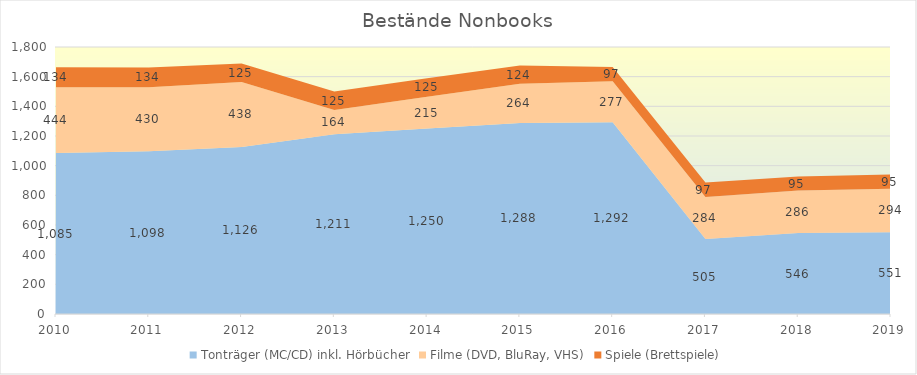
| Category | Tonträger (MC/CD) inkl. Hörbücher | Filme (DVD, BluRay, VHS) | Spiele (Brettspiele) |
|---|---|---|---|
| 2010.0 | 1085 | 444 | 134 |
| 2011.0 | 1098 | 430 | 134 |
| 2012.0 | 1126 | 438 | 125 |
| 2013.0 | 1211 | 164 | 125 |
| 2014.0 | 1250 | 215 | 125 |
| 2015.0 | 1288 | 264 | 124 |
| 2016.0 | 1292 | 277 | 97 |
| 2017.0 | 505 | 284 | 97 |
| 2018.0 | 546 | 286 | 95 |
| 2019.0 | 551 | 294 | 95 |